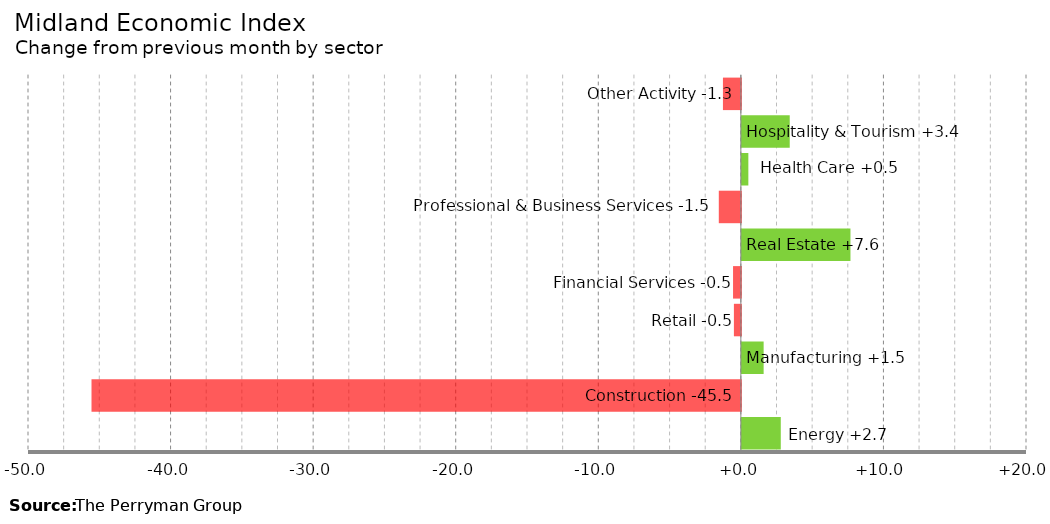
| Category | Change |
|---|---|
| Energy | 2.73 |
| Construction | -45.546 |
| Manufacturing | 1.528 |
| Retail | -0.488 |
| Financial Services | -0.548 |
| Real Estate | 7.617 |
| Professional & Business Services | -1.548 |
| Health Care | 0.455 |
| Hospitality & Tourism | 3.358 |
| Other Activity | -1.257 |